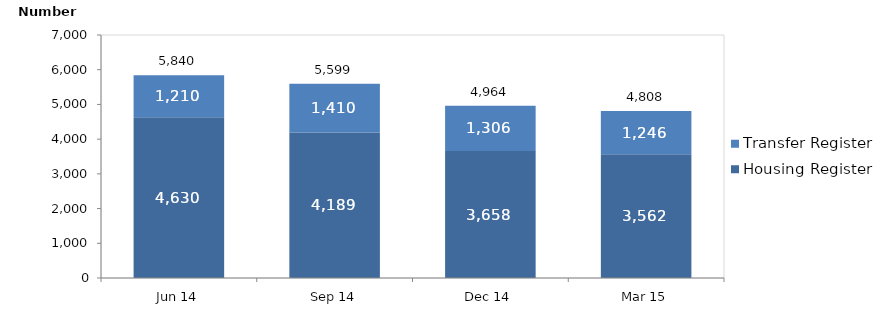
| Category | Housing Register | Transfer Register |
|---|---|---|
| Jun 14 | 4630 | 1210 |
| Sep 14 | 4189 | 1410 |
| Dec 14 | 3658 | 1306 |
| Mar 15 | 3562 | 1246 |